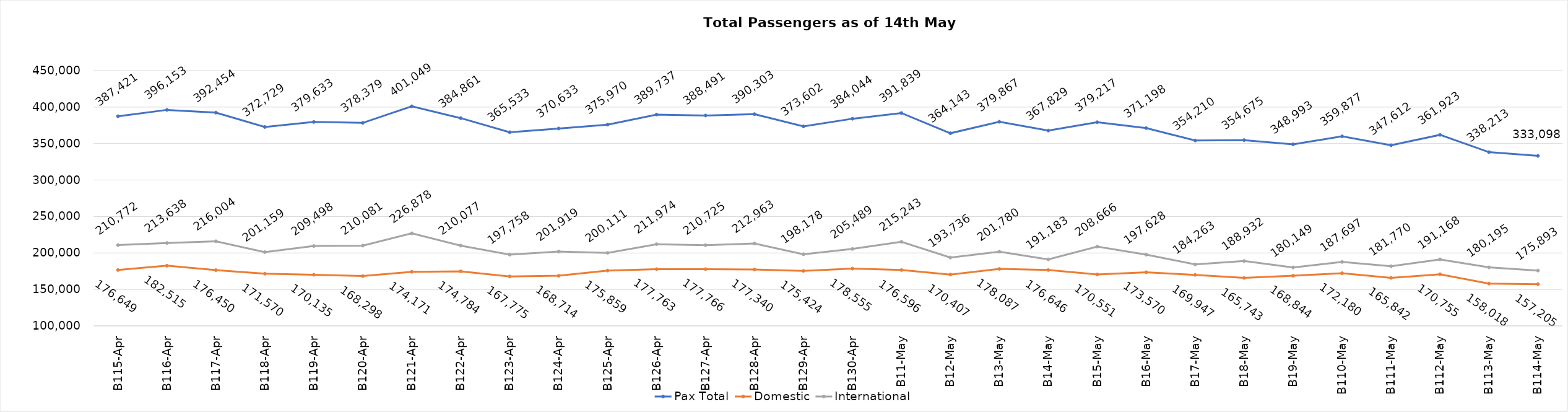
| Category | Pax Total | Domestic | International |
|---|---|---|---|
| 2024-04-15 | 387421 | 176649 | 210772 |
| 2024-04-16 | 396153 | 182515 | 213638 |
| 2024-04-17 | 392454 | 176450 | 216004 |
| 2024-04-18 | 372729 | 171570 | 201159 |
| 2024-04-19 | 379633 | 170135 | 209498 |
| 2024-04-20 | 378379 | 168298 | 210081 |
| 2024-04-21 | 401049 | 174171 | 226878 |
| 2024-04-22 | 384861 | 174784 | 210077 |
| 2024-04-23 | 365533 | 167775 | 197758 |
| 2024-04-24 | 370633 | 168714 | 201919 |
| 2024-04-25 | 375970 | 175859 | 200111 |
| 2024-04-26 | 389737 | 177763 | 211974 |
| 2024-04-27 | 388491 | 177766 | 210725 |
| 2024-04-28 | 390303 | 177340 | 212963 |
| 2024-04-29 | 373602 | 175424 | 198178 |
| 2024-04-30 | 384044 | 178555 | 205489 |
| 2024-05-01 | 391839 | 176596 | 215243 |
| 2024-05-02 | 364143 | 170407 | 193736 |
| 2024-05-03 | 379867 | 178087 | 201780 |
| 2024-05-04 | 367829 | 176646 | 191183 |
| 2024-05-05 | 379217 | 170551 | 208666 |
| 2024-05-06 | 371198 | 173570 | 197628 |
| 2024-05-07 | 354210 | 169947 | 184263 |
| 2024-05-08 | 354675 | 165743 | 188932 |
| 2024-05-09 | 348993 | 168844 | 180149 |
| 2024-05-10 | 359877 | 172180 | 187697 |
| 2024-05-11 | 347612 | 165842 | 181770 |
| 2024-05-12 | 361923 | 170755 | 191168 |
| 2024-05-13 | 338213 | 158018 | 180195 |
| 2024-05-14 | 333098 | 157205 | 175893 |